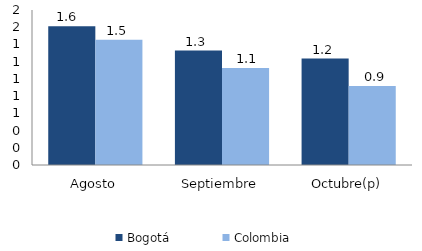
| Category | Bogotá | Colombia |
|---|---|---|
| Agosto | 1.612 | 1.455 |
| Septiembre | 1.329 | 1.126 |
| Octubre(p) | 1.236 | 0.918 |